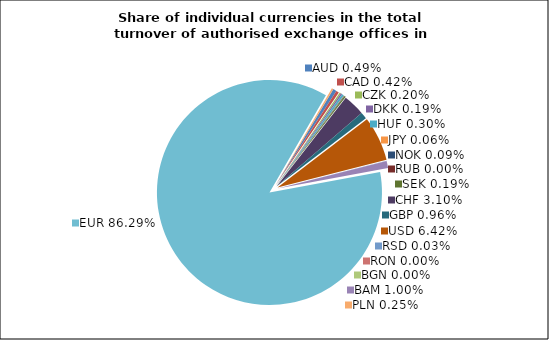
| Category | Series 0 |
|---|---|
| AUD | 0.487 |
| CAD | 0.419 |
| CZK | 0.202 |
| DKK | 0.194 |
| HUF | 0.302 |
| JPY | 0.064 |
| NOK | 0.086 |
| RUB | 0.003 |
| SEK | 0.186 |
| CHF | 3.096 |
| GBP | 0.964 |
| USD | 6.424 |
| RSD | 0.028 |
| RON | 0.002 |
| BGN | 0.002 |
| BAM | 1.005 |
| EUR | 86.289 |
| PLN | 0.247 |